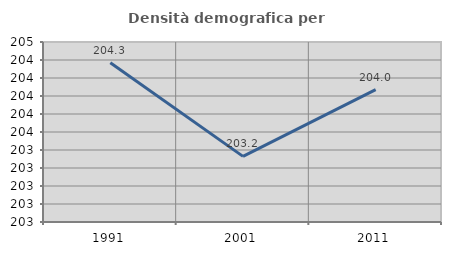
| Category | Densità demografica |
|---|---|
| 1991.0 | 204.269 |
| 2001.0 | 203.229 |
| 2011.0 | 203.972 |